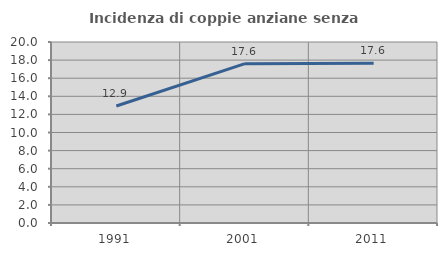
| Category | Incidenza di coppie anziane senza figli  |
|---|---|
| 1991.0 | 12.923 |
| 2001.0 | 17.608 |
| 2011.0 | 17.647 |